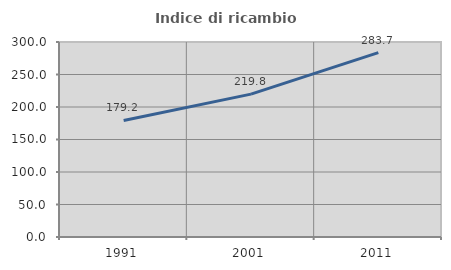
| Category | Indice di ricambio occupazionale  |
|---|---|
| 1991.0 | 179.241 |
| 2001.0 | 219.808 |
| 2011.0 | 283.706 |